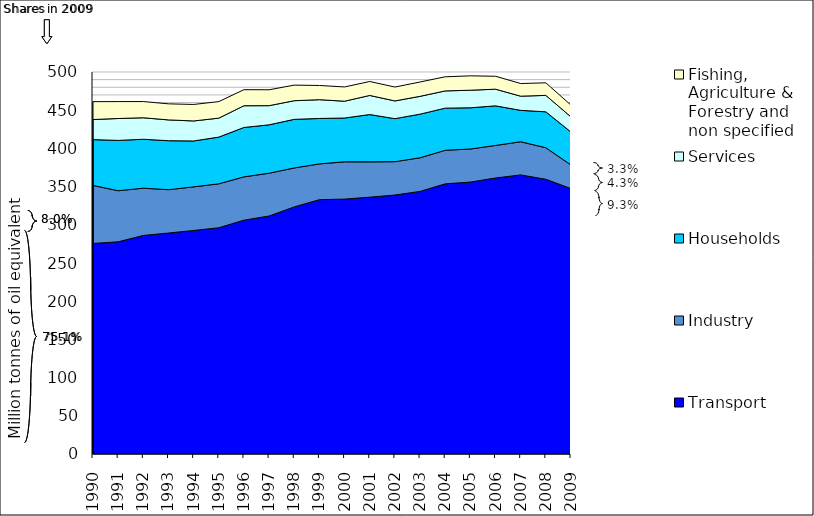
| Category | Transport | Industry | Households | Services | Fishing, Agriculture & Forestry and non specified |
|---|---|---|---|---|---|
| 1990.0 | 275.572 | 75.982 | 59.972 | 26.248 | 23.426 |
| 1991.0 | 277.763 | 66.817 | 65.88 | 28.678 | 22.146 |
| 1992.0 | 286.045 | 61.896 | 64.027 | 28.138 | 21.21 |
| 1993.0 | 289.24 | 56.709 | 64.116 | 27.249 | 21.016 |
| 1994.0 | 292.565 | 57.088 | 60.077 | 26.215 | 21.561 |
| 1995.0 | 296.139 | 57.528 | 61.126 | 24.828 | 21.64 |
| 1996.0 | 306.093 | 56.645 | 64.651 | 28.468 | 20.999 |
| 1997.0 | 311.491 | 56.041 | 63.338 | 25.058 | 20.802 |
| 1998.0 | 323.447 | 50.942 | 63.623 | 24.429 | 20.39 |
| 1999.0 | 332.897 | 46.823 | 59.477 | 24.57 | 18.584 |
| 2000.0 | 333.635 | 48.812 | 57.316 | 22.012 | 18.654 |
| 2001.0 | 336.182 | 46.239 | 61.906 | 24.983 | 18.275 |
| 2002.0 | 338.96 | 43.643 | 56.314 | 23.215 | 18.161 |
| 2003.0 | 343.716 | 43.999 | 57.102 | 23.337 | 18.758 |
| 2004.0 | 353.581 | 43.954 | 55.152 | 22.553 | 18.482 |
| 2005.0 | 355.926 | 43.305 | 53.931 | 22.996 | 18.83 |
| 2006.0 | 361.274 | 42.557 | 51.853 | 21.822 | 16.927 |
| 2007.0 | 365.299 | 43.423 | 41.088 | 18.551 | 16.559 |
| 2008.0 | 359.583 | 41.271 | 47.051 | 21.488 | 16.454 |
| 2009.0 | 347.416 | 30.832 | 43.119 | 19.872 | 15.359 |